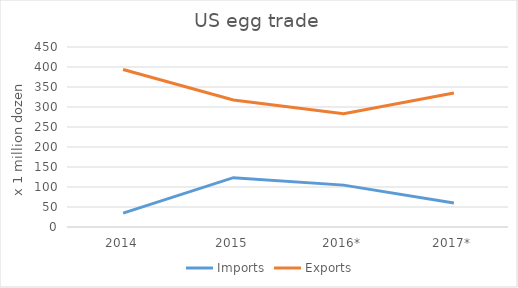
| Category | Imports | Exports |
|---|---|---|
| 2014 | 34.7 | 393.8 |
| 2015 | 123.3 | 317.6 |
| 2016* | 104.7 | 283.4 |
| 2017* | 60 | 335 |